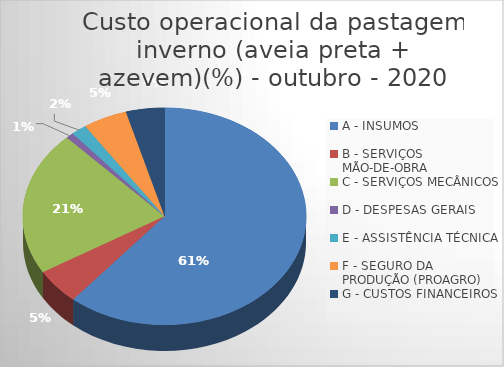
| Category | Series 0 |
|---|---|
| A - INSUMOS | 61.125 |
| B - SERVIÇOS MÃO-DE-OBRA | 5.283 |
| C - SERVIÇOS MECÂNICOS | 21.489 |
| D - DESPESAS GERAIS  | 0.879 |
| E - ASSISTÊNCIA TÉCNICA | 1.776 |
| F - SEGURO DA PRODUÇÃO (PROAGRO) | 5.051 |
| G - CUSTOS FINANCEIROS | 4.398 |